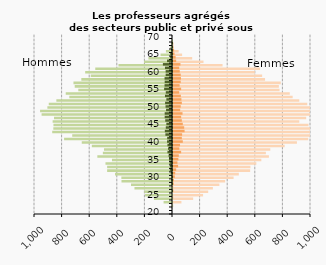
| Category | Femmes public | Femmes privé |
|---|---|---|
| 20.0 | 0 | 0 |
| 21.0 | 0 | 0 |
| 22.0 | 2 | 0 |
| 23.0 | 61 | 0 |
| 24.0 | 146 | 1 |
| 25.0 | 218 | 0 |
| 26.0 | 255 | 3 |
| 27.0 | 289 | 1 |
| 28.0 | 336 | 5 |
| 29.0 | 378 | 6 |
| 30.0 | 439 | 13 |
| 31.0 | 477 | 16 |
| 32.0 | 559 | 23 |
| 33.0 | 561 | 37 |
| 34.0 | 604 | 32 |
| 35.0 | 640 | 39 |
| 36.0 | 695 | 42 |
| 37.0 | 673 | 59 |
| 38.0 | 705 | 46 |
| 39.0 | 809 | 51 |
| 40.0 | 898 | 71 |
| 41.0 | 980 | 64 |
| 42.0 | 1030 | 66 |
| 43.0 | 1060 | 84 |
| 44.0 | 1078 | 81 |
| 45.0 | 982 | 71 |
| 46.0 | 915 | 64 |
| 47.0 | 965 | 59 |
| 48.0 | 1038 | 69 |
| 49.0 | 1018 | 52 |
| 50.0 | 1023 | 56 |
| 51.0 | 973 | 64 |
| 52.0 | 915 | 61 |
| 53.0 | 867 | 57 |
| 54.0 | 846 | 45 |
| 55.0 | 772 | 59 |
| 56.0 | 767 | 48 |
| 57.0 | 781 | 56 |
| 58.0 | 667 | 58 |
| 59.0 | 646 | 56 |
| 60.0 | 593 | 49 |
| 61.0 | 631 | 45 |
| 62.0 | 359 | 54 |
| 63.0 | 221 | 23 |
| 64.0 | 139 | 19 |
| 65.0 | 66 | 11 |
| 66.0 | 41 | 8 |
| 67.0 | 6 | 2 |
| 68.0 | 3 | 1 |
| 69.0 | 0 | 0 |
| 70.0 | 0 | 0 |